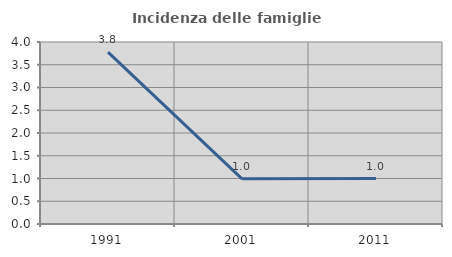
| Category | Incidenza delle famiglie numerose |
|---|---|
| 1991.0 | 3.778 |
| 2001.0 | 0.992 |
| 2011.0 | 0.998 |